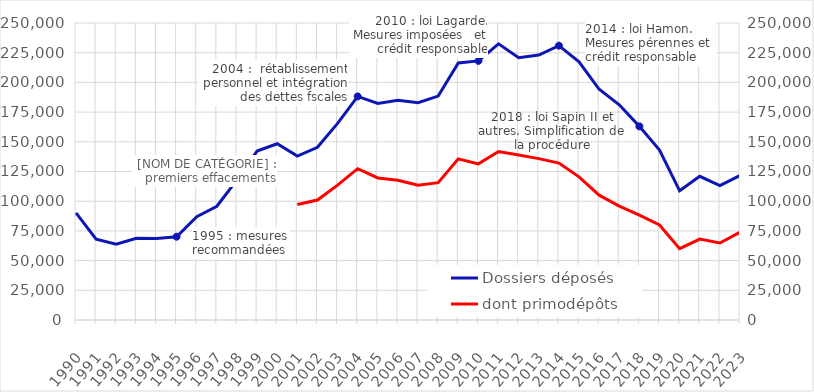
| Category | Dossiers déposés |
|---|---|
| 1990.0 | 90174 |
| 1991.0 | 68075 |
| 1992.0 | 63830 |
| 1993.0 | 68863 |
| 1994.0 | 68608 |
| 1995.0 | 70112 |
| 1996.0 | 86999 |
| 1997.0 | 95756 |
| 1998.0 | 117854 |
| 1999.0 | 142219 |
| 2000.0 | 148373 |
| 2001.0 | 137994 |
| 2002.0 | 145348 |
| 2003.0 | 165493 |
| 2004.0 | 188176 |
| 2005.0 | 182330 |
| 2006.0 | 184866 |
| 2007.0 | 182855 |
| 2008.0 | 188485 |
| 2009.0 | 216396 |
| 2010.0 | 218102 |
| 2011.0 | 232493 |
| 2012.0 | 220836 |
| 2013.0 | 223012 |
| 2014.0 | 230935 |
| 2015.0 | 217302 |
| 2016.0 | 194194 |
| 2017.0 | 181123 |
| 2018.0 | 162993 |
| 2019.0 | 143091 |
| 2020.0 | 108748 |
| 2021.0 | 120975 |
| 2022.0 | 113082 |
| 2023.0 | 121621 |